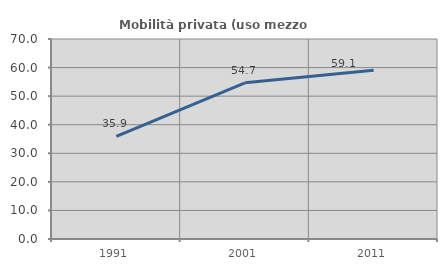
| Category | Mobilità privata (uso mezzo privato) |
|---|---|
| 1991.0 | 35.907 |
| 2001.0 | 54.662 |
| 2011.0 | 59.062 |